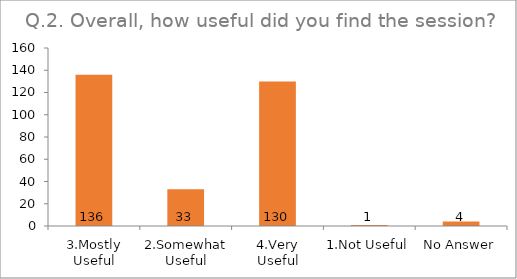
| Category | Q.2. Overall, how useful did you find the session? |
|---|---|
| 3.Mostly Useful | 136 |
| 2.Somewhat Useful | 33 |
| 4.Very Useful | 130 |
| 1.Not Useful | 1 |
| No Answer | 4 |